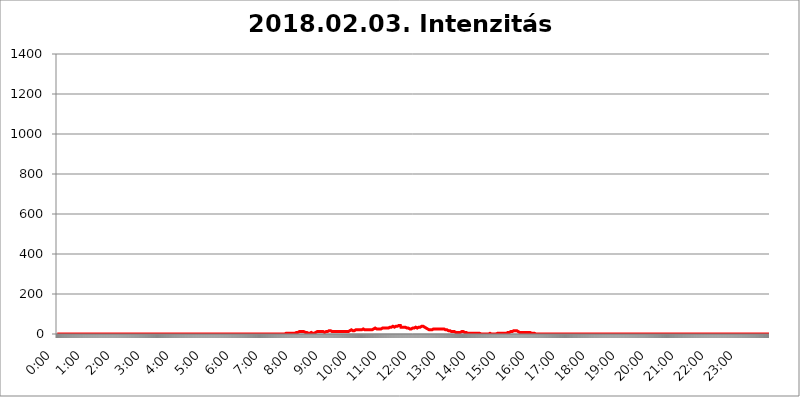
| Category | 2018.02.03. Intenzitás [W/m^2] |
|---|---|
| 0.0 | 0 |
| 0.0006944444444444445 | 0 |
| 0.001388888888888889 | 0 |
| 0.0020833333333333333 | 0 |
| 0.002777777777777778 | 0 |
| 0.003472222222222222 | 0 |
| 0.004166666666666667 | 0 |
| 0.004861111111111111 | 0 |
| 0.005555555555555556 | 0 |
| 0.0062499999999999995 | 0 |
| 0.006944444444444444 | 0 |
| 0.007638888888888889 | 0 |
| 0.008333333333333333 | 0 |
| 0.009027777777777779 | 0 |
| 0.009722222222222222 | 0 |
| 0.010416666666666666 | 0 |
| 0.011111111111111112 | 0 |
| 0.011805555555555555 | 0 |
| 0.012499999999999999 | 0 |
| 0.013194444444444444 | 0 |
| 0.013888888888888888 | 0 |
| 0.014583333333333332 | 0 |
| 0.015277777777777777 | 0 |
| 0.015972222222222224 | 0 |
| 0.016666666666666666 | 0 |
| 0.017361111111111112 | 0 |
| 0.018055555555555557 | 0 |
| 0.01875 | 0 |
| 0.019444444444444445 | 0 |
| 0.02013888888888889 | 0 |
| 0.020833333333333332 | 0 |
| 0.02152777777777778 | 0 |
| 0.022222222222222223 | 0 |
| 0.02291666666666667 | 0 |
| 0.02361111111111111 | 0 |
| 0.024305555555555556 | 0 |
| 0.024999999999999998 | 0 |
| 0.025694444444444447 | 0 |
| 0.02638888888888889 | 0 |
| 0.027083333333333334 | 0 |
| 0.027777777777777776 | 0 |
| 0.02847222222222222 | 0 |
| 0.029166666666666664 | 0 |
| 0.029861111111111113 | 0 |
| 0.030555555555555555 | 0 |
| 0.03125 | 0 |
| 0.03194444444444445 | 0 |
| 0.03263888888888889 | 0 |
| 0.03333333333333333 | 0 |
| 0.034027777777777775 | 0 |
| 0.034722222222222224 | 0 |
| 0.035416666666666666 | 0 |
| 0.036111111111111115 | 0 |
| 0.03680555555555556 | 0 |
| 0.0375 | 0 |
| 0.03819444444444444 | 0 |
| 0.03888888888888889 | 0 |
| 0.03958333333333333 | 0 |
| 0.04027777777777778 | 0 |
| 0.04097222222222222 | 0 |
| 0.041666666666666664 | 0 |
| 0.042361111111111106 | 0 |
| 0.04305555555555556 | 0 |
| 0.043750000000000004 | 0 |
| 0.044444444444444446 | 0 |
| 0.04513888888888889 | 0 |
| 0.04583333333333334 | 0 |
| 0.04652777777777778 | 0 |
| 0.04722222222222222 | 0 |
| 0.04791666666666666 | 0 |
| 0.04861111111111111 | 0 |
| 0.049305555555555554 | 0 |
| 0.049999999999999996 | 0 |
| 0.05069444444444445 | 0 |
| 0.051388888888888894 | 0 |
| 0.052083333333333336 | 0 |
| 0.05277777777777778 | 0 |
| 0.05347222222222222 | 0 |
| 0.05416666666666667 | 0 |
| 0.05486111111111111 | 0 |
| 0.05555555555555555 | 0 |
| 0.05625 | 0 |
| 0.05694444444444444 | 0 |
| 0.057638888888888885 | 0 |
| 0.05833333333333333 | 0 |
| 0.05902777777777778 | 0 |
| 0.059722222222222225 | 0 |
| 0.06041666666666667 | 0 |
| 0.061111111111111116 | 0 |
| 0.06180555555555556 | 0 |
| 0.0625 | 0 |
| 0.06319444444444444 | 0 |
| 0.06388888888888888 | 0 |
| 0.06458333333333334 | 0 |
| 0.06527777777777778 | 0 |
| 0.06597222222222222 | 0 |
| 0.06666666666666667 | 0 |
| 0.06736111111111111 | 0 |
| 0.06805555555555555 | 0 |
| 0.06874999999999999 | 0 |
| 0.06944444444444443 | 0 |
| 0.07013888888888889 | 0 |
| 0.07083333333333333 | 0 |
| 0.07152777777777779 | 0 |
| 0.07222222222222223 | 0 |
| 0.07291666666666667 | 0 |
| 0.07361111111111111 | 0 |
| 0.07430555555555556 | 0 |
| 0.075 | 0 |
| 0.07569444444444444 | 0 |
| 0.0763888888888889 | 0 |
| 0.07708333333333334 | 0 |
| 0.07777777777777778 | 0 |
| 0.07847222222222222 | 0 |
| 0.07916666666666666 | 0 |
| 0.0798611111111111 | 0 |
| 0.08055555555555556 | 0 |
| 0.08125 | 0 |
| 0.08194444444444444 | 0 |
| 0.08263888888888889 | 0 |
| 0.08333333333333333 | 0 |
| 0.08402777777777777 | 0 |
| 0.08472222222222221 | 0 |
| 0.08541666666666665 | 0 |
| 0.08611111111111112 | 0 |
| 0.08680555555555557 | 0 |
| 0.08750000000000001 | 0 |
| 0.08819444444444445 | 0 |
| 0.08888888888888889 | 0 |
| 0.08958333333333333 | 0 |
| 0.09027777777777778 | 0 |
| 0.09097222222222222 | 0 |
| 0.09166666666666667 | 0 |
| 0.09236111111111112 | 0 |
| 0.09305555555555556 | 0 |
| 0.09375 | 0 |
| 0.09444444444444444 | 0 |
| 0.09513888888888888 | 0 |
| 0.09583333333333333 | 0 |
| 0.09652777777777777 | 0 |
| 0.09722222222222222 | 0 |
| 0.09791666666666667 | 0 |
| 0.09861111111111111 | 0 |
| 0.09930555555555555 | 0 |
| 0.09999999999999999 | 0 |
| 0.10069444444444443 | 0 |
| 0.1013888888888889 | 0 |
| 0.10208333333333335 | 0 |
| 0.10277777777777779 | 0 |
| 0.10347222222222223 | 0 |
| 0.10416666666666667 | 0 |
| 0.10486111111111111 | 0 |
| 0.10555555555555556 | 0 |
| 0.10625 | 0 |
| 0.10694444444444444 | 0 |
| 0.1076388888888889 | 0 |
| 0.10833333333333334 | 0 |
| 0.10902777777777778 | 0 |
| 0.10972222222222222 | 0 |
| 0.1111111111111111 | 0 |
| 0.11180555555555556 | 0 |
| 0.11180555555555556 | 0 |
| 0.1125 | 0 |
| 0.11319444444444444 | 0 |
| 0.11388888888888889 | 0 |
| 0.11458333333333333 | 0 |
| 0.11527777777777777 | 0 |
| 0.11597222222222221 | 0 |
| 0.11666666666666665 | 0 |
| 0.1173611111111111 | 0 |
| 0.11805555555555557 | 0 |
| 0.11944444444444445 | 0 |
| 0.12013888888888889 | 0 |
| 0.12083333333333333 | 0 |
| 0.12152777777777778 | 0 |
| 0.12222222222222223 | 0 |
| 0.12291666666666667 | 0 |
| 0.12291666666666667 | 0 |
| 0.12361111111111112 | 0 |
| 0.12430555555555556 | 0 |
| 0.125 | 0 |
| 0.12569444444444444 | 0 |
| 0.12638888888888888 | 0 |
| 0.12708333333333333 | 0 |
| 0.16875 | 0 |
| 0.12847222222222224 | 0 |
| 0.12916666666666668 | 0 |
| 0.12986111111111112 | 0 |
| 0.13055555555555556 | 0 |
| 0.13125 | 0 |
| 0.13194444444444445 | 0 |
| 0.1326388888888889 | 0 |
| 0.13333333333333333 | 0 |
| 0.13402777777777777 | 0 |
| 0.13402777777777777 | 0 |
| 0.13472222222222222 | 0 |
| 0.13541666666666666 | 0 |
| 0.1361111111111111 | 0 |
| 0.13749999999999998 | 0 |
| 0.13819444444444443 | 0 |
| 0.1388888888888889 | 0 |
| 0.13958333333333334 | 0 |
| 0.14027777777777778 | 0 |
| 0.14097222222222222 | 0 |
| 0.14166666666666666 | 0 |
| 0.1423611111111111 | 0 |
| 0.14305555555555557 | 0 |
| 0.14375000000000002 | 0 |
| 0.14444444444444446 | 0 |
| 0.1451388888888889 | 0 |
| 0.1451388888888889 | 0 |
| 0.14652777777777778 | 0 |
| 0.14722222222222223 | 0 |
| 0.14791666666666667 | 0 |
| 0.1486111111111111 | 0 |
| 0.14930555555555555 | 0 |
| 0.15 | 0 |
| 0.15069444444444444 | 0 |
| 0.15138888888888888 | 0 |
| 0.15208333333333332 | 0 |
| 0.15277777777777776 | 0 |
| 0.15347222222222223 | 0 |
| 0.15416666666666667 | 0 |
| 0.15486111111111112 | 0 |
| 0.15555555555555556 | 0 |
| 0.15625 | 0 |
| 0.15694444444444444 | 0 |
| 0.15763888888888888 | 0 |
| 0.15833333333333333 | 0 |
| 0.15902777777777777 | 0 |
| 0.15972222222222224 | 0 |
| 0.16041666666666668 | 0 |
| 0.16111111111111112 | 0 |
| 0.16180555555555556 | 0 |
| 0.1625 | 0 |
| 0.16319444444444445 | 0 |
| 0.1638888888888889 | 0 |
| 0.16458333333333333 | 0 |
| 0.16527777777777777 | 0 |
| 0.16597222222222222 | 0 |
| 0.16666666666666666 | 0 |
| 0.1673611111111111 | 0 |
| 0.16805555555555554 | 0 |
| 0.16874999999999998 | 0 |
| 0.16944444444444443 | 0 |
| 0.17013888888888887 | 0 |
| 0.1708333333333333 | 0 |
| 0.17152777777777775 | 0 |
| 0.17222222222222225 | 0 |
| 0.1729166666666667 | 0 |
| 0.17361111111111113 | 0 |
| 0.17430555555555557 | 0 |
| 0.17500000000000002 | 0 |
| 0.17569444444444446 | 0 |
| 0.1763888888888889 | 0 |
| 0.17708333333333334 | 0 |
| 0.17777777777777778 | 0 |
| 0.17847222222222223 | 0 |
| 0.17916666666666667 | 0 |
| 0.1798611111111111 | 0 |
| 0.18055555555555555 | 0 |
| 0.18125 | 0 |
| 0.18194444444444444 | 0 |
| 0.1826388888888889 | 0 |
| 0.18333333333333335 | 0 |
| 0.1840277777777778 | 0 |
| 0.18472222222222223 | 0 |
| 0.18541666666666667 | 0 |
| 0.18611111111111112 | 0 |
| 0.18680555555555556 | 0 |
| 0.1875 | 0 |
| 0.18819444444444444 | 0 |
| 0.18888888888888888 | 0 |
| 0.18958333333333333 | 0 |
| 0.19027777777777777 | 0 |
| 0.1909722222222222 | 0 |
| 0.19166666666666665 | 0 |
| 0.19236111111111112 | 0 |
| 0.19305555555555554 | 0 |
| 0.19375 | 0 |
| 0.19444444444444445 | 0 |
| 0.1951388888888889 | 0 |
| 0.19583333333333333 | 0 |
| 0.19652777777777777 | 0 |
| 0.19722222222222222 | 0 |
| 0.19791666666666666 | 0 |
| 0.1986111111111111 | 0 |
| 0.19930555555555554 | 0 |
| 0.19999999999999998 | 0 |
| 0.20069444444444443 | 0 |
| 0.20138888888888887 | 0 |
| 0.2020833333333333 | 0 |
| 0.2027777777777778 | 0 |
| 0.2034722222222222 | 0 |
| 0.2041666666666667 | 0 |
| 0.20486111111111113 | 0 |
| 0.20555555555555557 | 0 |
| 0.20625000000000002 | 0 |
| 0.20694444444444446 | 0 |
| 0.2076388888888889 | 0 |
| 0.20833333333333334 | 0 |
| 0.20902777777777778 | 0 |
| 0.20972222222222223 | 0 |
| 0.21041666666666667 | 0 |
| 0.2111111111111111 | 0 |
| 0.21180555555555555 | 0 |
| 0.2125 | 0 |
| 0.21319444444444444 | 0 |
| 0.2138888888888889 | 0 |
| 0.21458333333333335 | 0 |
| 0.2152777777777778 | 0 |
| 0.21597222222222223 | 0 |
| 0.21666666666666667 | 0 |
| 0.21736111111111112 | 0 |
| 0.21805555555555556 | 0 |
| 0.21875 | 0 |
| 0.21944444444444444 | 0 |
| 0.22013888888888888 | 0 |
| 0.22083333333333333 | 0 |
| 0.22152777777777777 | 0 |
| 0.2222222222222222 | 0 |
| 0.22291666666666665 | 0 |
| 0.2236111111111111 | 0 |
| 0.22430555555555556 | 0 |
| 0.225 | 0 |
| 0.22569444444444445 | 0 |
| 0.2263888888888889 | 0 |
| 0.22708333333333333 | 0 |
| 0.22777777777777777 | 0 |
| 0.22847222222222222 | 0 |
| 0.22916666666666666 | 0 |
| 0.2298611111111111 | 0 |
| 0.23055555555555554 | 0 |
| 0.23124999999999998 | 0 |
| 0.23194444444444443 | 0 |
| 0.23263888888888887 | 0 |
| 0.2333333333333333 | 0 |
| 0.2340277777777778 | 0 |
| 0.2347222222222222 | 0 |
| 0.2354166666666667 | 0 |
| 0.23611111111111113 | 0 |
| 0.23680555555555557 | 0 |
| 0.23750000000000002 | 0 |
| 0.23819444444444446 | 0 |
| 0.2388888888888889 | 0 |
| 0.23958333333333334 | 0 |
| 0.24027777777777778 | 0 |
| 0.24097222222222223 | 0 |
| 0.24166666666666667 | 0 |
| 0.2423611111111111 | 0 |
| 0.24305555555555555 | 0 |
| 0.24375 | 0 |
| 0.24444444444444446 | 0 |
| 0.24513888888888888 | 0 |
| 0.24583333333333335 | 0 |
| 0.2465277777777778 | 0 |
| 0.24722222222222223 | 0 |
| 0.24791666666666667 | 0 |
| 0.24861111111111112 | 0 |
| 0.24930555555555556 | 0 |
| 0.25 | 0 |
| 0.25069444444444444 | 0 |
| 0.2513888888888889 | 0 |
| 0.2520833333333333 | 0 |
| 0.25277777777777777 | 0 |
| 0.2534722222222222 | 0 |
| 0.25416666666666665 | 0 |
| 0.2548611111111111 | 0 |
| 0.2555555555555556 | 0 |
| 0.25625000000000003 | 0 |
| 0.2569444444444445 | 0 |
| 0.2576388888888889 | 0 |
| 0.25833333333333336 | 0 |
| 0.2590277777777778 | 0 |
| 0.25972222222222224 | 0 |
| 0.2604166666666667 | 0 |
| 0.2611111111111111 | 0 |
| 0.26180555555555557 | 0 |
| 0.2625 | 0 |
| 0.26319444444444445 | 0 |
| 0.2638888888888889 | 0 |
| 0.26458333333333334 | 0 |
| 0.2652777777777778 | 0 |
| 0.2659722222222222 | 0 |
| 0.26666666666666666 | 0 |
| 0.2673611111111111 | 0 |
| 0.26805555555555555 | 0 |
| 0.26875 | 0 |
| 0.26944444444444443 | 0 |
| 0.2701388888888889 | 0 |
| 0.2708333333333333 | 0 |
| 0.27152777777777776 | 0 |
| 0.2722222222222222 | 0 |
| 0.27291666666666664 | 0 |
| 0.2736111111111111 | 0 |
| 0.2743055555555555 | 0 |
| 0.27499999999999997 | 0 |
| 0.27569444444444446 | 0 |
| 0.27638888888888885 | 0 |
| 0.27708333333333335 | 0 |
| 0.2777777777777778 | 0 |
| 0.27847222222222223 | 0 |
| 0.2791666666666667 | 0 |
| 0.2798611111111111 | 0 |
| 0.28055555555555556 | 0 |
| 0.28125 | 0 |
| 0.28194444444444444 | 0 |
| 0.2826388888888889 | 0 |
| 0.2833333333333333 | 0 |
| 0.28402777777777777 | 0 |
| 0.2847222222222222 | 0 |
| 0.28541666666666665 | 0 |
| 0.28611111111111115 | 0 |
| 0.28680555555555554 | 0 |
| 0.28750000000000003 | 0 |
| 0.2881944444444445 | 0 |
| 0.2888888888888889 | 0 |
| 0.28958333333333336 | 0 |
| 0.2902777777777778 | 0 |
| 0.29097222222222224 | 0 |
| 0.2916666666666667 | 0 |
| 0.2923611111111111 | 0 |
| 0.29305555555555557 | 0 |
| 0.29375 | 0 |
| 0.29444444444444445 | 0 |
| 0.2951388888888889 | 0 |
| 0.29583333333333334 | 0 |
| 0.2965277777777778 | 0 |
| 0.2972222222222222 | 0 |
| 0.29791666666666666 | 0 |
| 0.2986111111111111 | 0 |
| 0.29930555555555555 | 0 |
| 0.3 | 0 |
| 0.30069444444444443 | 0 |
| 0.3013888888888889 | 0 |
| 0.3020833333333333 | 0 |
| 0.30277777777777776 | 0 |
| 0.3034722222222222 | 0 |
| 0.30416666666666664 | 0 |
| 0.3048611111111111 | 0 |
| 0.3055555555555555 | 0 |
| 0.30624999999999997 | 0 |
| 0.3069444444444444 | 0 |
| 0.3076388888888889 | 0 |
| 0.30833333333333335 | 0 |
| 0.3090277777777778 | 0 |
| 0.30972222222222223 | 0 |
| 0.3104166666666667 | 0 |
| 0.3111111111111111 | 0 |
| 0.31180555555555556 | 0 |
| 0.3125 | 0 |
| 0.31319444444444444 | 0 |
| 0.3138888888888889 | 0 |
| 0.3145833333333333 | 0 |
| 0.31527777777777777 | 0 |
| 0.3159722222222222 | 0 |
| 0.31666666666666665 | 0 |
| 0.31736111111111115 | 0 |
| 0.31805555555555554 | 0 |
| 0.31875000000000003 | 0 |
| 0.3194444444444445 | 0 |
| 0.3201388888888889 | 0 |
| 0.32083333333333336 | 3.525 |
| 0.3215277777777778 | 3.525 |
| 0.32222222222222224 | 3.525 |
| 0.3229166666666667 | 3.525 |
| 0.3236111111111111 | 3.525 |
| 0.32430555555555557 | 3.525 |
| 0.325 | 3.525 |
| 0.32569444444444445 | 3.525 |
| 0.3263888888888889 | 3.525 |
| 0.32708333333333334 | 3.525 |
| 0.3277777777777778 | 3.525 |
| 0.3284722222222222 | 3.525 |
| 0.32916666666666666 | 3.525 |
| 0.3298611111111111 | 3.525 |
| 0.33055555555555555 | 3.525 |
| 0.33125 | 3.525 |
| 0.33194444444444443 | 3.525 |
| 0.3326388888888889 | 3.525 |
| 0.3333333333333333 | 3.525 |
| 0.3340277777777778 | 7.887 |
| 0.3347222222222222 | 7.887 |
| 0.3354166666666667 | 7.887 |
| 0.3361111111111111 | 7.887 |
| 0.3368055555555556 | 7.887 |
| 0.33749999999999997 | 7.887 |
| 0.33819444444444446 | 7.887 |
| 0.33888888888888885 | 12.257 |
| 0.33958333333333335 | 12.257 |
| 0.34027777777777773 | 12.257 |
| 0.34097222222222223 | 12.257 |
| 0.3416666666666666 | 12.257 |
| 0.3423611111111111 | 12.257 |
| 0.3430555555555555 | 12.257 |
| 0.34375 | 12.257 |
| 0.3444444444444445 | 12.257 |
| 0.3451388888888889 | 12.257 |
| 0.3458333333333334 | 12.257 |
| 0.34652777777777777 | 12.257 |
| 0.34722222222222227 | 7.887 |
| 0.34791666666666665 | 7.887 |
| 0.34861111111111115 | 7.887 |
| 0.34930555555555554 | 7.887 |
| 0.35000000000000003 | 7.887 |
| 0.3506944444444444 | 3.525 |
| 0.3513888888888889 | 3.525 |
| 0.3520833333333333 | 3.525 |
| 0.3527777777777778 | 3.525 |
| 0.3534722222222222 | 3.525 |
| 0.3541666666666667 | 3.525 |
| 0.3548611111111111 | 3.525 |
| 0.35555555555555557 | 3.525 |
| 0.35625 | 7.887 |
| 0.35694444444444445 | 7.887 |
| 0.3576388888888889 | 7.887 |
| 0.35833333333333334 | 3.525 |
| 0.3590277777777778 | 3.525 |
| 0.3597222222222222 | 3.525 |
| 0.36041666666666666 | 3.525 |
| 0.3611111111111111 | 3.525 |
| 0.36180555555555555 | 7.887 |
| 0.3625 | 7.887 |
| 0.36319444444444443 | 7.887 |
| 0.3638888888888889 | 7.887 |
| 0.3645833333333333 | 12.257 |
| 0.3652777777777778 | 12.257 |
| 0.3659722222222222 | 12.257 |
| 0.3666666666666667 | 12.257 |
| 0.3673611111111111 | 12.257 |
| 0.3680555555555556 | 12.257 |
| 0.36874999999999997 | 12.257 |
| 0.36944444444444446 | 12.257 |
| 0.37013888888888885 | 12.257 |
| 0.37083333333333335 | 12.257 |
| 0.37152777777777773 | 12.257 |
| 0.37222222222222223 | 12.257 |
| 0.3729166666666666 | 12.257 |
| 0.3736111111111111 | 12.257 |
| 0.3743055555555555 | 12.257 |
| 0.375 | 7.887 |
| 0.3756944444444445 | 12.257 |
| 0.3763888888888889 | 12.257 |
| 0.3770833333333334 | 12.257 |
| 0.37777777777777777 | 12.257 |
| 0.37847222222222227 | 12.257 |
| 0.37916666666666665 | 12.257 |
| 0.37986111111111115 | 12.257 |
| 0.38055555555555554 | 16.636 |
| 0.38125000000000003 | 16.636 |
| 0.3819444444444444 | 16.636 |
| 0.3826388888888889 | 16.636 |
| 0.3833333333333333 | 16.636 |
| 0.3840277777777778 | 12.257 |
| 0.3847222222222222 | 12.257 |
| 0.3854166666666667 | 12.257 |
| 0.3861111111111111 | 12.257 |
| 0.38680555555555557 | 12.257 |
| 0.3875 | 12.257 |
| 0.38819444444444445 | 12.257 |
| 0.3888888888888889 | 12.257 |
| 0.38958333333333334 | 12.257 |
| 0.3902777777777778 | 12.257 |
| 0.3909722222222222 | 12.257 |
| 0.39166666666666666 | 12.257 |
| 0.3923611111111111 | 12.257 |
| 0.39305555555555555 | 12.257 |
| 0.39375 | 12.257 |
| 0.39444444444444443 | 12.257 |
| 0.3951388888888889 | 12.257 |
| 0.3958333333333333 | 12.257 |
| 0.3965277777777778 | 12.257 |
| 0.3972222222222222 | 12.257 |
| 0.3979166666666667 | 12.257 |
| 0.3986111111111111 | 12.257 |
| 0.3993055555555556 | 12.257 |
| 0.39999999999999997 | 12.257 |
| 0.40069444444444446 | 12.257 |
| 0.40138888888888885 | 12.257 |
| 0.40208333333333335 | 12.257 |
| 0.40277777777777773 | 12.257 |
| 0.40347222222222223 | 12.257 |
| 0.4041666666666666 | 12.257 |
| 0.4048611111111111 | 12.257 |
| 0.4055555555555555 | 12.257 |
| 0.40625 | 12.257 |
| 0.4069444444444445 | 12.257 |
| 0.4076388888888889 | 12.257 |
| 0.4083333333333334 | 12.257 |
| 0.40902777777777777 | 16.636 |
| 0.40972222222222227 | 16.636 |
| 0.41041666666666665 | 16.636 |
| 0.41111111111111115 | 16.636 |
| 0.41180555555555554 | 21.024 |
| 0.41250000000000003 | 21.024 |
| 0.4131944444444444 | 16.636 |
| 0.4138888888888889 | 16.636 |
| 0.4145833333333333 | 16.636 |
| 0.4152777777777778 | 16.636 |
| 0.4159722222222222 | 16.636 |
| 0.4166666666666667 | 16.636 |
| 0.4173611111111111 | 16.636 |
| 0.41805555555555557 | 16.636 |
| 0.41875 | 21.024 |
| 0.41944444444444445 | 21.024 |
| 0.4201388888888889 | 21.024 |
| 0.42083333333333334 | 21.024 |
| 0.4215277777777778 | 21.024 |
| 0.4222222222222222 | 21.024 |
| 0.42291666666666666 | 21.024 |
| 0.4236111111111111 | 21.024 |
| 0.42430555555555555 | 21.024 |
| 0.425 | 21.024 |
| 0.42569444444444443 | 25.419 |
| 0.4263888888888889 | 21.024 |
| 0.4270833333333333 | 21.024 |
| 0.4277777777777778 | 21.024 |
| 0.4284722222222222 | 21.024 |
| 0.4291666666666667 | 25.419 |
| 0.4298611111111111 | 25.419 |
| 0.4305555555555556 | 21.024 |
| 0.43124999999999997 | 21.024 |
| 0.43194444444444446 | 21.024 |
| 0.43263888888888885 | 21.024 |
| 0.43333333333333335 | 21.024 |
| 0.43402777777777773 | 21.024 |
| 0.43472222222222223 | 21.024 |
| 0.4354166666666666 | 21.024 |
| 0.4361111111111111 | 21.024 |
| 0.4368055555555555 | 21.024 |
| 0.4375 | 21.024 |
| 0.4381944444444445 | 21.024 |
| 0.4388888888888889 | 21.024 |
| 0.4395833333333334 | 21.024 |
| 0.44027777777777777 | 21.024 |
| 0.44097222222222227 | 21.024 |
| 0.44166666666666665 | 21.024 |
| 0.44236111111111115 | 21.024 |
| 0.44305555555555554 | 25.419 |
| 0.44375000000000003 | 25.419 |
| 0.4444444444444444 | 25.419 |
| 0.4451388888888889 | 29.823 |
| 0.4458333333333333 | 29.823 |
| 0.4465277777777778 | 29.823 |
| 0.4472222222222222 | 25.419 |
| 0.4479166666666667 | 25.419 |
| 0.4486111111111111 | 29.823 |
| 0.44930555555555557 | 25.419 |
| 0.45 | 25.419 |
| 0.45069444444444445 | 25.419 |
| 0.4513888888888889 | 25.419 |
| 0.45208333333333334 | 25.419 |
| 0.4527777777777778 | 25.419 |
| 0.4534722222222222 | 25.419 |
| 0.45416666666666666 | 25.419 |
| 0.4548611111111111 | 29.823 |
| 0.45555555555555555 | 29.823 |
| 0.45625 | 29.823 |
| 0.45694444444444443 | 34.234 |
| 0.4576388888888889 | 29.823 |
| 0.4583333333333333 | 29.823 |
| 0.4590277777777778 | 29.823 |
| 0.4597222222222222 | 29.823 |
| 0.4604166666666667 | 29.823 |
| 0.4611111111111111 | 29.823 |
| 0.4618055555555556 | 29.823 |
| 0.46249999999999997 | 29.823 |
| 0.46319444444444446 | 29.823 |
| 0.46388888888888885 | 29.823 |
| 0.46458333333333335 | 29.823 |
| 0.46527777777777773 | 34.234 |
| 0.46597222222222223 | 29.823 |
| 0.4666666666666666 | 34.234 |
| 0.4673611111111111 | 34.234 |
| 0.4680555555555555 | 34.234 |
| 0.46875 | 34.234 |
| 0.4694444444444445 | 34.234 |
| 0.4701388888888889 | 34.234 |
| 0.4708333333333334 | 38.653 |
| 0.47152777777777777 | 34.234 |
| 0.47222222222222227 | 34.234 |
| 0.47291666666666665 | 34.234 |
| 0.47361111111111115 | 34.234 |
| 0.47430555555555554 | 38.653 |
| 0.47500000000000003 | 38.653 |
| 0.4756944444444444 | 34.234 |
| 0.4763888888888889 | 38.653 |
| 0.4770833333333333 | 38.653 |
| 0.4777777777777778 | 38.653 |
| 0.4784722222222222 | 38.653 |
| 0.4791666666666667 | 43.079 |
| 0.4798611111111111 | 38.653 |
| 0.48055555555555557 | 38.653 |
| 0.48125 | 43.079 |
| 0.48194444444444445 | 34.234 |
| 0.4826388888888889 | 38.653 |
| 0.48333333333333334 | 38.653 |
| 0.4840277777777778 | 34.234 |
| 0.4847222222222222 | 34.234 |
| 0.48541666666666666 | 34.234 |
| 0.4861111111111111 | 34.234 |
| 0.48680555555555555 | 34.234 |
| 0.4875 | 38.653 |
| 0.48819444444444443 | 34.234 |
| 0.4888888888888889 | 34.234 |
| 0.4895833333333333 | 34.234 |
| 0.4902777777777778 | 29.823 |
| 0.4909722222222222 | 29.823 |
| 0.4916666666666667 | 29.823 |
| 0.4923611111111111 | 29.823 |
| 0.4930555555555556 | 25.419 |
| 0.49374999999999997 | 25.419 |
| 0.49444444444444446 | 25.419 |
| 0.49513888888888885 | 21.024 |
| 0.49583333333333335 | 25.419 |
| 0.49652777777777773 | 25.419 |
| 0.49722222222222223 | 29.823 |
| 0.4979166666666666 | 25.419 |
| 0.4986111111111111 | 29.823 |
| 0.4993055555555555 | 29.823 |
| 0.5 | 29.823 |
| 0.5006944444444444 | 29.823 |
| 0.5013888888888889 | 34.234 |
| 0.5020833333333333 | 34.234 |
| 0.5027777777777778 | 34.234 |
| 0.5034722222222222 | 34.234 |
| 0.5041666666666667 | 34.234 |
| 0.5048611111111111 | 29.823 |
| 0.5055555555555555 | 34.234 |
| 0.50625 | 34.234 |
| 0.5069444444444444 | 34.234 |
| 0.5076388888888889 | 34.234 |
| 0.5083333333333333 | 34.234 |
| 0.5090277777777777 | 34.234 |
| 0.5097222222222222 | 38.653 |
| 0.5104166666666666 | 38.653 |
| 0.5111111111111112 | 38.653 |
| 0.5118055555555555 | 38.653 |
| 0.5125000000000001 | 38.653 |
| 0.5131944444444444 | 38.653 |
| 0.513888888888889 | 38.653 |
| 0.5145833333333333 | 34.234 |
| 0.5152777777777778 | 34.234 |
| 0.5159722222222222 | 29.823 |
| 0.5166666666666667 | 29.823 |
| 0.517361111111111 | 29.823 |
| 0.5180555555555556 | 25.419 |
| 0.5187499999999999 | 25.419 |
| 0.5194444444444445 | 25.419 |
| 0.5201388888888888 | 25.419 |
| 0.5208333333333334 | 25.419 |
| 0.5215277777777778 | 21.024 |
| 0.5222222222222223 | 21.024 |
| 0.5229166666666667 | 21.024 |
| 0.5236111111111111 | 21.024 |
| 0.5243055555555556 | 21.024 |
| 0.525 | 21.024 |
| 0.5256944444444445 | 21.024 |
| 0.5263888888888889 | 21.024 |
| 0.5270833333333333 | 25.419 |
| 0.5277777777777778 | 25.419 |
| 0.5284722222222222 | 25.419 |
| 0.5291666666666667 | 25.419 |
| 0.5298611111111111 | 25.419 |
| 0.5305555555555556 | 21.024 |
| 0.53125 | 25.419 |
| 0.5319444444444444 | 25.419 |
| 0.5326388888888889 | 21.024 |
| 0.5333333333333333 | 25.419 |
| 0.5340277777777778 | 25.419 |
| 0.5347222222222222 | 25.419 |
| 0.5354166666666667 | 25.419 |
| 0.5361111111111111 | 25.419 |
| 0.5368055555555555 | 25.419 |
| 0.5375 | 25.419 |
| 0.5381944444444444 | 25.419 |
| 0.5388888888888889 | 25.419 |
| 0.5395833333333333 | 25.419 |
| 0.5402777777777777 | 25.419 |
| 0.5409722222222222 | 25.419 |
| 0.5416666666666666 | 25.419 |
| 0.5423611111111112 | 25.419 |
| 0.5430555555555555 | 25.419 |
| 0.5437500000000001 | 25.419 |
| 0.5444444444444444 | 21.024 |
| 0.545138888888889 | 21.024 |
| 0.5458333333333333 | 21.024 |
| 0.5465277777777778 | 21.024 |
| 0.5472222222222222 | 21.024 |
| 0.5479166666666667 | 21.024 |
| 0.548611111111111 | 16.636 |
| 0.5493055555555556 | 16.636 |
| 0.5499999999999999 | 16.636 |
| 0.5506944444444445 | 16.636 |
| 0.5513888888888888 | 12.257 |
| 0.5520833333333334 | 12.257 |
| 0.5527777777777778 | 12.257 |
| 0.5534722222222223 | 12.257 |
| 0.5541666666666667 | 12.257 |
| 0.5548611111111111 | 12.257 |
| 0.5555555555555556 | 12.257 |
| 0.55625 | 12.257 |
| 0.5569444444444445 | 12.257 |
| 0.5576388888888889 | 12.257 |
| 0.5583333333333333 | 7.887 |
| 0.5590277777777778 | 7.887 |
| 0.5597222222222222 | 12.257 |
| 0.5604166666666667 | 7.887 |
| 0.5611111111111111 | 7.887 |
| 0.5618055555555556 | 7.887 |
| 0.5625 | 7.887 |
| 0.5631944444444444 | 7.887 |
| 0.5638888888888889 | 7.887 |
| 0.5645833333333333 | 7.887 |
| 0.5652777777777778 | 7.887 |
| 0.5659722222222222 | 7.887 |
| 0.5666666666666667 | 7.887 |
| 0.5673611111111111 | 12.257 |
| 0.5680555555555555 | 12.257 |
| 0.56875 | 7.887 |
| 0.5694444444444444 | 12.257 |
| 0.5701388888888889 | 12.257 |
| 0.5708333333333333 | 12.257 |
| 0.5715277777777777 | 7.887 |
| 0.5722222222222222 | 7.887 |
| 0.5729166666666666 | 7.887 |
| 0.5736111111111112 | 7.887 |
| 0.5743055555555555 | 7.887 |
| 0.5750000000000001 | 7.887 |
| 0.5756944444444444 | 3.525 |
| 0.576388888888889 | 3.525 |
| 0.5770833333333333 | 3.525 |
| 0.5777777777777778 | 3.525 |
| 0.5784722222222222 | 3.525 |
| 0.5791666666666667 | 3.525 |
| 0.579861111111111 | 3.525 |
| 0.5805555555555556 | 3.525 |
| 0.5812499999999999 | 3.525 |
| 0.5819444444444445 | 3.525 |
| 0.5826388888888888 | 3.525 |
| 0.5833333333333334 | 3.525 |
| 0.5840277777777778 | 3.525 |
| 0.5847222222222223 | 3.525 |
| 0.5854166666666667 | 3.525 |
| 0.5861111111111111 | 3.525 |
| 0.5868055555555556 | 3.525 |
| 0.5875 | 3.525 |
| 0.5881944444444445 | 3.525 |
| 0.5888888888888889 | 3.525 |
| 0.5895833333333333 | 3.525 |
| 0.5902777777777778 | 3.525 |
| 0.5909722222222222 | 3.525 |
| 0.5916666666666667 | 3.525 |
| 0.5923611111111111 | 3.525 |
| 0.5930555555555556 | 0 |
| 0.59375 | 0 |
| 0.5944444444444444 | 0 |
| 0.5951388888888889 | 0 |
| 0.5958333333333333 | 0 |
| 0.5965277777777778 | 0 |
| 0.5972222222222222 | 0 |
| 0.5979166666666667 | 0 |
| 0.5986111111111111 | 0 |
| 0.5993055555555555 | 0 |
| 0.6 | 0 |
| 0.6006944444444444 | 0 |
| 0.6013888888888889 | 0 |
| 0.6020833333333333 | 0 |
| 0.6027777777777777 | 0 |
| 0.6034722222222222 | 0 |
| 0.6041666666666666 | 3.525 |
| 0.6048611111111112 | 0 |
| 0.6055555555555555 | 3.525 |
| 0.6062500000000001 | 0 |
| 0.6069444444444444 | 3.525 |
| 0.607638888888889 | 0 |
| 0.6083333333333333 | 0 |
| 0.6090277777777778 | 0 |
| 0.6097222222222222 | 0 |
| 0.6104166666666667 | 0 |
| 0.611111111111111 | 0 |
| 0.6118055555555556 | 0 |
| 0.6124999999999999 | 0 |
| 0.6131944444444445 | 0 |
| 0.6138888888888888 | 0 |
| 0.6145833333333334 | 0 |
| 0.6152777777777778 | 0 |
| 0.6159722222222223 | 0 |
| 0.6166666666666667 | 3.525 |
| 0.6173611111111111 | 3.525 |
| 0.6180555555555556 | 3.525 |
| 0.61875 | 3.525 |
| 0.6194444444444445 | 3.525 |
| 0.6201388888888889 | 3.525 |
| 0.6208333333333333 | 3.525 |
| 0.6215277777777778 | 3.525 |
| 0.6222222222222222 | 3.525 |
| 0.6229166666666667 | 3.525 |
| 0.6236111111111111 | 3.525 |
| 0.6243055555555556 | 3.525 |
| 0.625 | 3.525 |
| 0.6256944444444444 | 3.525 |
| 0.6263888888888889 | 3.525 |
| 0.6270833333333333 | 3.525 |
| 0.6277777777777778 | 3.525 |
| 0.6284722222222222 | 7.887 |
| 0.6291666666666667 | 3.525 |
| 0.6298611111111111 | 3.525 |
| 0.6305555555555555 | 3.525 |
| 0.63125 | 7.887 |
| 0.6319444444444444 | 7.887 |
| 0.6326388888888889 | 7.887 |
| 0.6333333333333333 | 7.887 |
| 0.6340277777777777 | 7.887 |
| 0.6347222222222222 | 12.257 |
| 0.6354166666666666 | 12.257 |
| 0.6361111111111112 | 12.257 |
| 0.6368055555555555 | 12.257 |
| 0.6375000000000001 | 12.257 |
| 0.6381944444444444 | 12.257 |
| 0.638888888888889 | 12.257 |
| 0.6395833333333333 | 12.257 |
| 0.6402777777777778 | 16.636 |
| 0.6409722222222222 | 12.257 |
| 0.6416666666666667 | 16.636 |
| 0.642361111111111 | 16.636 |
| 0.6430555555555556 | 16.636 |
| 0.6437499999999999 | 16.636 |
| 0.6444444444444445 | 16.636 |
| 0.6451388888888888 | 12.257 |
| 0.6458333333333334 | 12.257 |
| 0.6465277777777778 | 12.257 |
| 0.6472222222222223 | 12.257 |
| 0.6479166666666667 | 7.887 |
| 0.6486111111111111 | 7.887 |
| 0.6493055555555556 | 7.887 |
| 0.65 | 7.887 |
| 0.6506944444444445 | 7.887 |
| 0.6513888888888889 | 7.887 |
| 0.6520833333333333 | 7.887 |
| 0.6527777777777778 | 7.887 |
| 0.6534722222222222 | 7.887 |
| 0.6541666666666667 | 7.887 |
| 0.6548611111111111 | 7.887 |
| 0.6555555555555556 | 7.887 |
| 0.65625 | 7.887 |
| 0.6569444444444444 | 7.887 |
| 0.6576388888888889 | 7.887 |
| 0.6583333333333333 | 7.887 |
| 0.6590277777777778 | 7.887 |
| 0.6597222222222222 | 7.887 |
| 0.6604166666666667 | 7.887 |
| 0.6611111111111111 | 7.887 |
| 0.6618055555555555 | 7.887 |
| 0.6625 | 7.887 |
| 0.6631944444444444 | 7.887 |
| 0.6638888888888889 | 7.887 |
| 0.6645833333333333 | 3.525 |
| 0.6652777777777777 | 3.525 |
| 0.6659722222222222 | 3.525 |
| 0.6666666666666666 | 3.525 |
| 0.6673611111111111 | 3.525 |
| 0.6680555555555556 | 3.525 |
| 0.6687500000000001 | 3.525 |
| 0.6694444444444444 | 3.525 |
| 0.6701388888888888 | 0 |
| 0.6708333333333334 | 0 |
| 0.6715277777777778 | 0 |
| 0.6722222222222222 | 0 |
| 0.6729166666666666 | 0 |
| 0.6736111111111112 | 0 |
| 0.6743055555555556 | 0 |
| 0.6749999999999999 | 0 |
| 0.6756944444444444 | 0 |
| 0.6763888888888889 | 0 |
| 0.6770833333333334 | 0 |
| 0.6777777777777777 | 0 |
| 0.6784722222222223 | 0 |
| 0.6791666666666667 | 0 |
| 0.6798611111111111 | 0 |
| 0.6805555555555555 | 0 |
| 0.68125 | 0 |
| 0.6819444444444445 | 0 |
| 0.6826388888888889 | 0 |
| 0.6833333333333332 | 0 |
| 0.6840277777777778 | 0 |
| 0.6847222222222222 | 0 |
| 0.6854166666666667 | 0 |
| 0.686111111111111 | 0 |
| 0.6868055555555556 | 0 |
| 0.6875 | 0 |
| 0.6881944444444444 | 0 |
| 0.688888888888889 | 0 |
| 0.6895833333333333 | 0 |
| 0.6902777777777778 | 0 |
| 0.6909722222222222 | 0 |
| 0.6916666666666668 | 0 |
| 0.6923611111111111 | 0 |
| 0.6930555555555555 | 0 |
| 0.69375 | 0 |
| 0.6944444444444445 | 0 |
| 0.6951388888888889 | 0 |
| 0.6958333333333333 | 0 |
| 0.6965277777777777 | 0 |
| 0.6972222222222223 | 0 |
| 0.6979166666666666 | 0 |
| 0.6986111111111111 | 0 |
| 0.6993055555555556 | 0 |
| 0.7000000000000001 | 0 |
| 0.7006944444444444 | 0 |
| 0.7013888888888888 | 0 |
| 0.7020833333333334 | 0 |
| 0.7027777777777778 | 0 |
| 0.7034722222222222 | 0 |
| 0.7041666666666666 | 0 |
| 0.7048611111111112 | 0 |
| 0.7055555555555556 | 0 |
| 0.7062499999999999 | 0 |
| 0.7069444444444444 | 0 |
| 0.7076388888888889 | 0 |
| 0.7083333333333334 | 0 |
| 0.7090277777777777 | 0 |
| 0.7097222222222223 | 0 |
| 0.7104166666666667 | 0 |
| 0.7111111111111111 | 0 |
| 0.7118055555555555 | 0 |
| 0.7125 | 0 |
| 0.7131944444444445 | 0 |
| 0.7138888888888889 | 0 |
| 0.7145833333333332 | 0 |
| 0.7152777777777778 | 0 |
| 0.7159722222222222 | 0 |
| 0.7166666666666667 | 0 |
| 0.717361111111111 | 0 |
| 0.7180555555555556 | 0 |
| 0.71875 | 0 |
| 0.7194444444444444 | 0 |
| 0.720138888888889 | 0 |
| 0.7208333333333333 | 0 |
| 0.7215277777777778 | 0 |
| 0.7222222222222222 | 0 |
| 0.7229166666666668 | 0 |
| 0.7236111111111111 | 0 |
| 0.7243055555555555 | 0 |
| 0.725 | 0 |
| 0.7256944444444445 | 0 |
| 0.7263888888888889 | 0 |
| 0.7270833333333333 | 0 |
| 0.7277777777777777 | 0 |
| 0.7284722222222223 | 0 |
| 0.7291666666666666 | 0 |
| 0.7298611111111111 | 0 |
| 0.7305555555555556 | 0 |
| 0.7312500000000001 | 0 |
| 0.7319444444444444 | 0 |
| 0.7326388888888888 | 0 |
| 0.7333333333333334 | 0 |
| 0.7340277777777778 | 0 |
| 0.7347222222222222 | 0 |
| 0.7354166666666666 | 0 |
| 0.7361111111111112 | 0 |
| 0.7368055555555556 | 0 |
| 0.7374999999999999 | 0 |
| 0.7381944444444444 | 0 |
| 0.7388888888888889 | 0 |
| 0.7395833333333334 | 0 |
| 0.7402777777777777 | 0 |
| 0.7409722222222223 | 0 |
| 0.7416666666666667 | 0 |
| 0.7423611111111111 | 0 |
| 0.7430555555555555 | 0 |
| 0.74375 | 0 |
| 0.7444444444444445 | 0 |
| 0.7451388888888889 | 0 |
| 0.7458333333333332 | 0 |
| 0.7465277777777778 | 0 |
| 0.7472222222222222 | 0 |
| 0.7479166666666667 | 0 |
| 0.748611111111111 | 0 |
| 0.7493055555555556 | 0 |
| 0.75 | 0 |
| 0.7506944444444444 | 0 |
| 0.751388888888889 | 0 |
| 0.7520833333333333 | 0 |
| 0.7527777777777778 | 0 |
| 0.7534722222222222 | 0 |
| 0.7541666666666668 | 0 |
| 0.7548611111111111 | 0 |
| 0.7555555555555555 | 0 |
| 0.75625 | 0 |
| 0.7569444444444445 | 0 |
| 0.7576388888888889 | 0 |
| 0.7583333333333333 | 0 |
| 0.7590277777777777 | 0 |
| 0.7597222222222223 | 0 |
| 0.7604166666666666 | 0 |
| 0.7611111111111111 | 0 |
| 0.7618055555555556 | 0 |
| 0.7625000000000001 | 0 |
| 0.7631944444444444 | 0 |
| 0.7638888888888888 | 0 |
| 0.7645833333333334 | 0 |
| 0.7652777777777778 | 0 |
| 0.7659722222222222 | 0 |
| 0.7666666666666666 | 0 |
| 0.7673611111111112 | 0 |
| 0.7680555555555556 | 0 |
| 0.7687499999999999 | 0 |
| 0.7694444444444444 | 0 |
| 0.7701388888888889 | 0 |
| 0.7708333333333334 | 0 |
| 0.7715277777777777 | 0 |
| 0.7722222222222223 | 0 |
| 0.7729166666666667 | 0 |
| 0.7736111111111111 | 0 |
| 0.7743055555555555 | 0 |
| 0.775 | 0 |
| 0.7756944444444445 | 0 |
| 0.7763888888888889 | 0 |
| 0.7770833333333332 | 0 |
| 0.7777777777777778 | 0 |
| 0.7784722222222222 | 0 |
| 0.7791666666666667 | 0 |
| 0.779861111111111 | 0 |
| 0.7805555555555556 | 0 |
| 0.78125 | 0 |
| 0.7819444444444444 | 0 |
| 0.782638888888889 | 0 |
| 0.7833333333333333 | 0 |
| 0.7840277777777778 | 0 |
| 0.7847222222222222 | 0 |
| 0.7854166666666668 | 0 |
| 0.7861111111111111 | 0 |
| 0.7868055555555555 | 0 |
| 0.7875 | 0 |
| 0.7881944444444445 | 0 |
| 0.7888888888888889 | 0 |
| 0.7895833333333333 | 0 |
| 0.7902777777777777 | 0 |
| 0.7909722222222223 | 0 |
| 0.7916666666666666 | 0 |
| 0.7923611111111111 | 0 |
| 0.7930555555555556 | 0 |
| 0.7937500000000001 | 0 |
| 0.7944444444444444 | 0 |
| 0.7951388888888888 | 0 |
| 0.7958333333333334 | 0 |
| 0.7965277777777778 | 0 |
| 0.7972222222222222 | 0 |
| 0.7979166666666666 | 0 |
| 0.7986111111111112 | 0 |
| 0.7993055555555556 | 0 |
| 0.7999999999999999 | 0 |
| 0.8006944444444444 | 0 |
| 0.8013888888888889 | 0 |
| 0.8020833333333334 | 0 |
| 0.8027777777777777 | 0 |
| 0.8034722222222223 | 0 |
| 0.8041666666666667 | 0 |
| 0.8048611111111111 | 0 |
| 0.8055555555555555 | 0 |
| 0.80625 | 0 |
| 0.8069444444444445 | 0 |
| 0.8076388888888889 | 0 |
| 0.8083333333333332 | 0 |
| 0.8090277777777778 | 0 |
| 0.8097222222222222 | 0 |
| 0.8104166666666667 | 0 |
| 0.811111111111111 | 0 |
| 0.8118055555555556 | 0 |
| 0.8125 | 0 |
| 0.8131944444444444 | 0 |
| 0.813888888888889 | 0 |
| 0.8145833333333333 | 0 |
| 0.8152777777777778 | 0 |
| 0.8159722222222222 | 0 |
| 0.8166666666666668 | 0 |
| 0.8173611111111111 | 0 |
| 0.8180555555555555 | 0 |
| 0.81875 | 0 |
| 0.8194444444444445 | 0 |
| 0.8201388888888889 | 0 |
| 0.8208333333333333 | 0 |
| 0.8215277777777777 | 0 |
| 0.8222222222222223 | 0 |
| 0.8229166666666666 | 0 |
| 0.8236111111111111 | 0 |
| 0.8243055555555556 | 0 |
| 0.8250000000000001 | 0 |
| 0.8256944444444444 | 0 |
| 0.8263888888888888 | 0 |
| 0.8270833333333334 | 0 |
| 0.8277777777777778 | 0 |
| 0.8284722222222222 | 0 |
| 0.8291666666666666 | 0 |
| 0.8298611111111112 | 0 |
| 0.8305555555555556 | 0 |
| 0.8312499999999999 | 0 |
| 0.8319444444444444 | 0 |
| 0.8326388888888889 | 0 |
| 0.8333333333333334 | 0 |
| 0.8340277777777777 | 0 |
| 0.8347222222222223 | 0 |
| 0.8354166666666667 | 0 |
| 0.8361111111111111 | 0 |
| 0.8368055555555555 | 0 |
| 0.8375 | 0 |
| 0.8381944444444445 | 0 |
| 0.8388888888888889 | 0 |
| 0.8395833333333332 | 0 |
| 0.8402777777777778 | 0 |
| 0.8409722222222222 | 0 |
| 0.8416666666666667 | 0 |
| 0.842361111111111 | 0 |
| 0.8430555555555556 | 0 |
| 0.84375 | 0 |
| 0.8444444444444444 | 0 |
| 0.845138888888889 | 0 |
| 0.8458333333333333 | 0 |
| 0.8465277777777778 | 0 |
| 0.8472222222222222 | 0 |
| 0.8479166666666668 | 0 |
| 0.8486111111111111 | 0 |
| 0.8493055555555555 | 0 |
| 0.85 | 0 |
| 0.8506944444444445 | 0 |
| 0.8513888888888889 | 0 |
| 0.8520833333333333 | 0 |
| 0.8527777777777777 | 0 |
| 0.8534722222222223 | 0 |
| 0.8541666666666666 | 0 |
| 0.8548611111111111 | 0 |
| 0.8555555555555556 | 0 |
| 0.8562500000000001 | 0 |
| 0.8569444444444444 | 0 |
| 0.8576388888888888 | 0 |
| 0.8583333333333334 | 0 |
| 0.8590277777777778 | 0 |
| 0.8597222222222222 | 0 |
| 0.8604166666666666 | 0 |
| 0.8611111111111112 | 0 |
| 0.8618055555555556 | 0 |
| 0.8624999999999999 | 0 |
| 0.8631944444444444 | 0 |
| 0.8638888888888889 | 0 |
| 0.8645833333333334 | 0 |
| 0.8652777777777777 | 0 |
| 0.8659722222222223 | 0 |
| 0.8666666666666667 | 0 |
| 0.8673611111111111 | 0 |
| 0.8680555555555555 | 0 |
| 0.86875 | 0 |
| 0.8694444444444445 | 0 |
| 0.8701388888888889 | 0 |
| 0.8708333333333332 | 0 |
| 0.8715277777777778 | 0 |
| 0.8722222222222222 | 0 |
| 0.8729166666666667 | 0 |
| 0.873611111111111 | 0 |
| 0.8743055555555556 | 0 |
| 0.875 | 0 |
| 0.8756944444444444 | 0 |
| 0.876388888888889 | 0 |
| 0.8770833333333333 | 0 |
| 0.8777777777777778 | 0 |
| 0.8784722222222222 | 0 |
| 0.8791666666666668 | 0 |
| 0.8798611111111111 | 0 |
| 0.8805555555555555 | 0 |
| 0.88125 | 0 |
| 0.8819444444444445 | 0 |
| 0.8826388888888889 | 0 |
| 0.8833333333333333 | 0 |
| 0.8840277777777777 | 0 |
| 0.8847222222222223 | 0 |
| 0.8854166666666666 | 0 |
| 0.8861111111111111 | 0 |
| 0.8868055555555556 | 0 |
| 0.8875000000000001 | 0 |
| 0.8881944444444444 | 0 |
| 0.8888888888888888 | 0 |
| 0.8895833333333334 | 0 |
| 0.8902777777777778 | 0 |
| 0.8909722222222222 | 0 |
| 0.8916666666666666 | 0 |
| 0.8923611111111112 | 0 |
| 0.8930555555555556 | 0 |
| 0.8937499999999999 | 0 |
| 0.8944444444444444 | 0 |
| 0.8951388888888889 | 0 |
| 0.8958333333333334 | 0 |
| 0.8965277777777777 | 0 |
| 0.8972222222222223 | 0 |
| 0.8979166666666667 | 0 |
| 0.8986111111111111 | 0 |
| 0.8993055555555555 | 0 |
| 0.9 | 0 |
| 0.9006944444444445 | 0 |
| 0.9013888888888889 | 0 |
| 0.9020833333333332 | 0 |
| 0.9027777777777778 | 0 |
| 0.9034722222222222 | 0 |
| 0.9041666666666667 | 0 |
| 0.904861111111111 | 0 |
| 0.9055555555555556 | 0 |
| 0.90625 | 0 |
| 0.9069444444444444 | 0 |
| 0.907638888888889 | 0 |
| 0.9083333333333333 | 0 |
| 0.9090277777777778 | 0 |
| 0.9097222222222222 | 0 |
| 0.9104166666666668 | 0 |
| 0.9111111111111111 | 0 |
| 0.9118055555555555 | 0 |
| 0.9125 | 0 |
| 0.9131944444444445 | 0 |
| 0.9138888888888889 | 0 |
| 0.9145833333333333 | 0 |
| 0.9152777777777777 | 0 |
| 0.9159722222222223 | 0 |
| 0.9166666666666666 | 0 |
| 0.9173611111111111 | 0 |
| 0.9180555555555556 | 0 |
| 0.9187500000000001 | 0 |
| 0.9194444444444444 | 0 |
| 0.9201388888888888 | 0 |
| 0.9208333333333334 | 0 |
| 0.9215277777777778 | 0 |
| 0.9222222222222222 | 0 |
| 0.9229166666666666 | 0 |
| 0.9236111111111112 | 0 |
| 0.9243055555555556 | 0 |
| 0.9249999999999999 | 0 |
| 0.9256944444444444 | 0 |
| 0.9263888888888889 | 0 |
| 0.9270833333333334 | 0 |
| 0.9277777777777777 | 0 |
| 0.9284722222222223 | 0 |
| 0.9291666666666667 | 0 |
| 0.9298611111111111 | 0 |
| 0.9305555555555555 | 0 |
| 0.93125 | 0 |
| 0.9319444444444445 | 0 |
| 0.9326388888888889 | 0 |
| 0.9333333333333332 | 0 |
| 0.9340277777777778 | 0 |
| 0.9347222222222222 | 0 |
| 0.9354166666666667 | 0 |
| 0.936111111111111 | 0 |
| 0.9368055555555556 | 0 |
| 0.9375 | 0 |
| 0.9381944444444444 | 0 |
| 0.938888888888889 | 0 |
| 0.9395833333333333 | 0 |
| 0.9402777777777778 | 0 |
| 0.9409722222222222 | 0 |
| 0.9416666666666668 | 0 |
| 0.9423611111111111 | 0 |
| 0.9430555555555555 | 0 |
| 0.94375 | 0 |
| 0.9444444444444445 | 0 |
| 0.9451388888888889 | 0 |
| 0.9458333333333333 | 0 |
| 0.9465277777777777 | 0 |
| 0.9472222222222223 | 0 |
| 0.9479166666666666 | 0 |
| 0.9486111111111111 | 0 |
| 0.9493055555555556 | 0 |
| 0.9500000000000001 | 0 |
| 0.9506944444444444 | 0 |
| 0.9513888888888888 | 0 |
| 0.9520833333333334 | 0 |
| 0.9527777777777778 | 0 |
| 0.9534722222222222 | 0 |
| 0.9541666666666666 | 0 |
| 0.9548611111111112 | 0 |
| 0.9555555555555556 | 0 |
| 0.9562499999999999 | 0 |
| 0.9569444444444444 | 0 |
| 0.9576388888888889 | 0 |
| 0.9583333333333334 | 0 |
| 0.9590277777777777 | 0 |
| 0.9597222222222223 | 0 |
| 0.9604166666666667 | 0 |
| 0.9611111111111111 | 0 |
| 0.9618055555555555 | 0 |
| 0.9625 | 0 |
| 0.9631944444444445 | 0 |
| 0.9638888888888889 | 0 |
| 0.9645833333333332 | 0 |
| 0.9652777777777778 | 0 |
| 0.9659722222222222 | 0 |
| 0.9666666666666667 | 0 |
| 0.967361111111111 | 0 |
| 0.9680555555555556 | 0 |
| 0.96875 | 0 |
| 0.9694444444444444 | 0 |
| 0.970138888888889 | 0 |
| 0.9708333333333333 | 0 |
| 0.9715277777777778 | 0 |
| 0.9722222222222222 | 0 |
| 0.9729166666666668 | 0 |
| 0.9736111111111111 | 0 |
| 0.9743055555555555 | 0 |
| 0.975 | 0 |
| 0.9756944444444445 | 0 |
| 0.9763888888888889 | 0 |
| 0.9770833333333333 | 0 |
| 0.9777777777777777 | 0 |
| 0.9784722222222223 | 0 |
| 0.9791666666666666 | 0 |
| 0.9798611111111111 | 0 |
| 0.9805555555555556 | 0 |
| 0.9812500000000001 | 0 |
| 0.9819444444444444 | 0 |
| 0.9826388888888888 | 0 |
| 0.9833333333333334 | 0 |
| 0.9840277777777778 | 0 |
| 0.9847222222222222 | 0 |
| 0.9854166666666666 | 0 |
| 0.9861111111111112 | 0 |
| 0.9868055555555556 | 0 |
| 0.9874999999999999 | 0 |
| 0.9881944444444444 | 0 |
| 0.9888888888888889 | 0 |
| 0.9895833333333334 | 0 |
| 0.9902777777777777 | 0 |
| 0.9909722222222223 | 0 |
| 0.9916666666666667 | 0 |
| 0.9923611111111111 | 0 |
| 0.9930555555555555 | 0 |
| 0.99375 | 0 |
| 0.9944444444444445 | 0 |
| 0.9951388888888889 | 0 |
| 0.9958333333333332 | 0 |
| 0.9965277777777778 | 0 |
| 0.9972222222222222 | 0 |
| 0.9979166666666667 | 0 |
| 0.998611111111111 | 0 |
| 0.9993055555555556 | 0 |